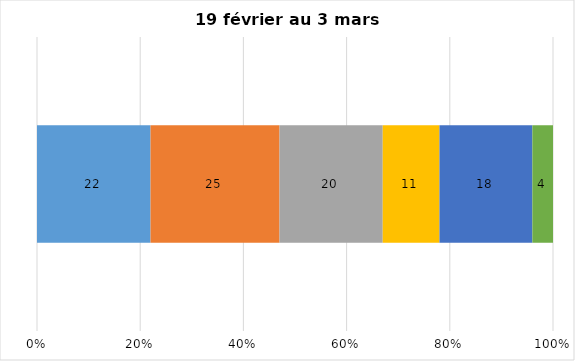
| Category | Plusieurs fois par jour | Une fois par jour | Quelques fois par semaine   | Une fois par semaine ou moins   |  Jamais   |  Je n’utilise pas les médias sociaux |
|---|---|---|---|---|---|---|
| 0 | 22 | 25 | 20 | 11 | 18 | 4 |